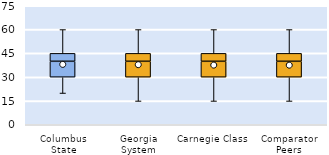
| Category | 25th | 50th | 75th |
|---|---|---|---|
| Columbus State | 30 | 10 | 5 |
| Georgia System | 30 | 10 | 5 |
| Carnegie Class | 30 | 10 | 5 |
| Comparator Peers | 30 | 10 | 5 |